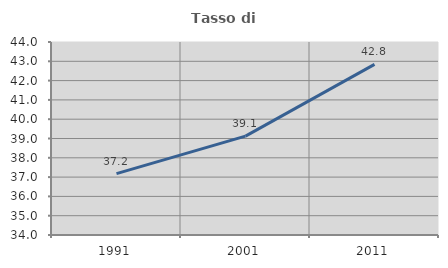
| Category | Tasso di occupazione   |
|---|---|
| 1991.0 | 37.178 |
| 2001.0 | 39.125 |
| 2011.0 | 42.844 |